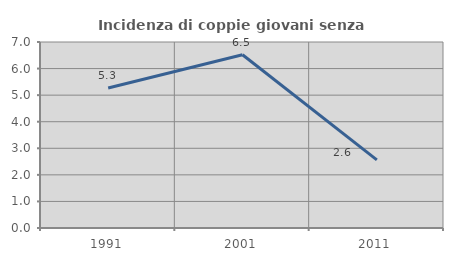
| Category | Incidenza di coppie giovani senza figli |
|---|---|
| 1991.0 | 5.269 |
| 2001.0 | 6.522 |
| 2011.0 | 2.564 |